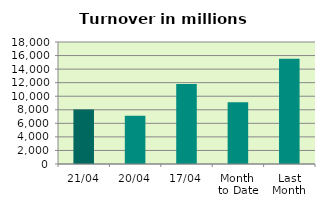
| Category | Series 0 |
|---|---|
| 21/04 | 8039.767 |
| 20/04 | 7115.861 |
| 17/04 | 11811.464 |
| Month 
to Date | 9117.061 |
| Last
Month | 15518.097 |